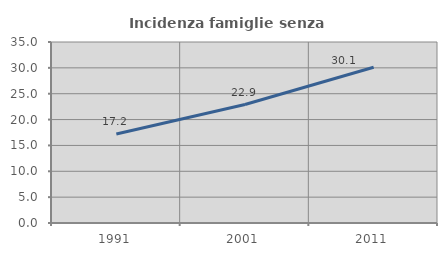
| Category | Incidenza famiglie senza nuclei |
|---|---|
| 1991.0 | 17.206 |
| 2001.0 | 22.904 |
| 2011.0 | 30.115 |